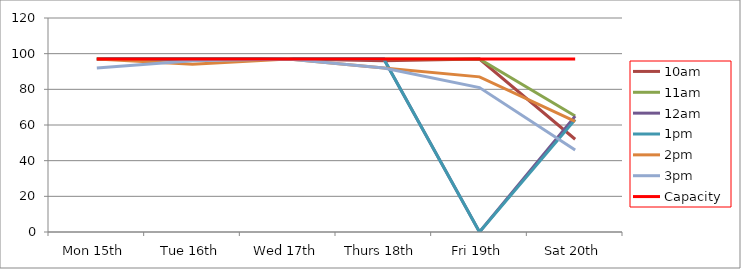
| Category | 9am | 10am | 11am | 12am | 1pm | 2pm | 3pm | 4pm | 5pm | Capacity |
|---|---|---|---|---|---|---|---|---|---|---|
| Mon 15th |  | 97 | 97 | 97 | 97 | 97 | 92 |  |  | 97 |
| Tue 16th |  | 97 | 97 | 97 | 97 | 94 | 96 |  |  | 97 |
| Wed 17th |  | 97 | 97 | 97 | 97 | 97 | 97 |  |  | 97 |
| Thurs 18th |  | 96 | 97 | 97 | 97 | 92 | 92 |  |  | 97 |
| Fri 19th |  | 97 | 97 | 0 | 0 | 87 | 81 |  |  | 97 |
| Sat 20th |  | 52 | 65 | 65 | 63 | 62 | 46 |  |  | 97 |